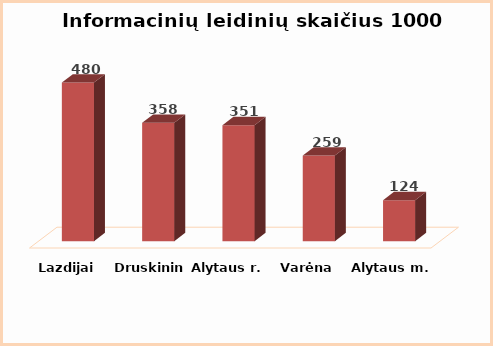
| Category | Series 0 |
|---|---|
| Lazdijai | 480 |
| Druskininkai | 358 |
| Alytaus r. | 351 |
| Varėna | 259 |
| Alytaus m. | 124 |